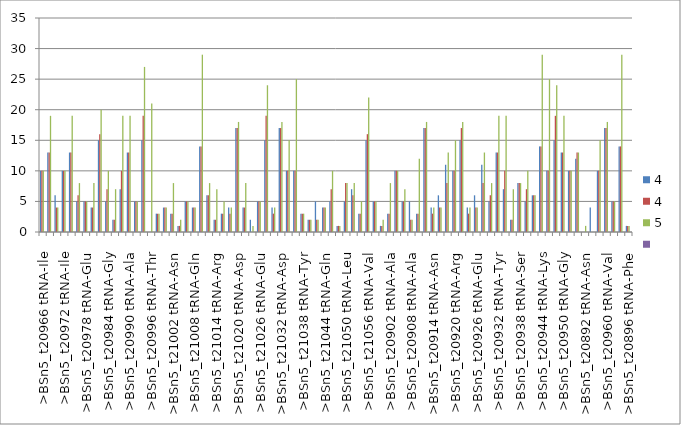
| Category | 4 | 5 | Series 3 |
|---|---|---|---|
| >BSn5_t20966 tRNA-Ile | 10 | 10 |  |
| >BSn5_t20968 tRNA-Ala | 13 | 19 |  |
| >BSn5_t20970 tRNA-Ser | 4 | 4 |  |
| >BSn5_t20972 tRNA-Ile | 10 | 10 |  |
| >BSn5_t20974 tRNA-Ala | 13 | 19 |  |
| >BSn5_t20976 tRNA-Met | 6 | 8 |  |
| >BSn5_t20978 tRNA-Glu | 5 | 5 |  |
| >BSn5_t20980 tRNA-Asn | 4 | 8 |  |
| >BSn5_t20982 tRNA-Thr | 16 | 20 |  |
| >BSn5_t20984 tRNA-Gly | 7 | 10 |  |
| >BSn5_t20986 tRNA-Arg | 2 | 7 |  |
| >BSn5_t20988 tRNA-Pro | 10 | 19 |  |
| >BSn5_t20990 tRNA-Ala | 13 | 19 |  |
| >BSn5_t20992 tRNA-Glu | 5 | 5 |  |
| >BSn5_t20994 tRNA-Val | 19 | 27 |  |
| >BSn5_t20996 tRNA-Thr | 0 | 21 |  |
| >BSn5_t20998 tRNA-Tyr | 3 | 3 |  |
| >BSn5_t21000 tRNA-Gln | 4 | 4 |  |
| >BSn5_t21002 tRNA-Asn | 3 | 8 |  |
| >BSn5_t21004 tRNA-Ser | 1 | 2 |  |
| >BSn5_t21006 tRNA-Glu | 5 | 5 |  |
| >BSn5_t21008 tRNA-Gln | 4 | 4 |  |
| >BSn5_t21010 tRNA-Lys | 14 | 29 |  |
| >BSn5_t21012 tRNA-Leu | 6 | 8 |  |
| >BSn5_t21014 tRNA-Arg | 2 | 7 |  |
| >BSn5_t21016 tRNA-Gly | 3 | 5 |  |
| >BSn5_t21018 tRNA-Met | 3 | 4 |  |
| >BSn5_t21020 tRNA-Asp | 17 | 18 |  |
| >BSn5_t21022 tRNA-Asn | 4 | 8 |  |
| >BSn5_t21024 tRNA-Ser | 0 | 1 |  |
| >BSn5_t21026 tRNA-Glu | 5 | 5 |  |
| >BSn5_t21028 tRNA-Val | 19 | 24 |  |
| >BSn5_t21030 tRNA-Met | 3 | 4 |  |
| >BSn5_t21032 tRNA-Asp | 17 | 18 |  |
| >BSn5_t21034 tRNA-Phe | 10 | 15 |  |
| >BSn5_t21036 tRNA-Thr | 10 | 25 |  |
| >BSn5_t21038 tRNA-Tyr | 3 | 3 |  |
| >BSn5_t21040 tRNA-Trp | 2 | 2 |  |
| >BSn5_t21042 tRNA-His | 2 | 2 |  |
| >BSn5_t21044 tRNA-Gln | 4 | 4 |  |
| >BSn5_t21046 tRNA-Gly | 7 | 10 |  |
| >BSn5_t21048 tRNA-Cys | 1 | 1 |  |
| >BSn5_t21050 tRNA-Leu | 8 | 8 |  |
| >BSn5_t21052 tRNA-Leu | 6 | 8 |  |
| >BSn5_t21054 tRNA-Gly | 3 | 5 |  |
| >BSn5_t21056 tRNA-Val | 16 | 22 |  |
| >BSn5_t20898 tRNA-Gln | 5 | 5 |  |
| >BSn5_t20900 tRNA-Ile | 1 | 2 |  |
| >BSn5_t20902 tRNA-Ala | 3 | 8 |  |
| >BSn5_t20904 tRNA-Ser | 10 | 10 |  |
| >BSn5_t20906 tRNA-Ile | 5 | 7 |  |
| >BSn5_t20908 tRNA-Ala | 2 | 2 |  |
| >BSn5_t20910 tRNA-Met | 3 | 12 |  |
| >BSn5_t20912 tRNA-Glu | 17 | 18 |  |
| >BSn5_t20914 tRNA-Asn | 3 | 4 |  |
| >BSn5_t20916 tRNA-Thr | 4 | 4 |  |
| >BSn5_t20918 tRNA-Gly | 8 | 13 |  |
| >BSn5_t20920 tRNA-Arg | 10 | 15 |  |
| >BSn5_t20922 tRNA-Pro | 17 | 18 |  |
| >BSn5_t20924 tRNA-Ala | 3 | 4 |  |
| >BSn5_t20926 tRNA-Glu | 4 | 4 |  |
| >BSn5_t20928 tRNA-Val | 8 | 13 |  |
| >BSn5_t20930 tRNA-Thr | 6 | 8 |  |
| >BSn5_t20932 tRNA-Tyr | 13 | 19 |  |
| >BSn5_t20934 tRNA-Gln | 10 | 19 |  |
| >BSn5_t20936 tRNA-Asn | 2 | 7 |  |
| >BSn5_t20938 tRNA-Ser | 8 | 8 |  |
| >BSn5_t20940 tRNA-Glu | 7 | 10 |  |
| >BSn5_t20942 tRNA-Gln | 6 | 6 |  |
| >BSn5_t20944 tRNA-Lys | 14 | 29 |  |
| >BSn5_t20946 tRNA-Leu | 10 | 25 |  |
| >BSn5_t20948 tRNA-Arg | 19 | 24 |  |
| >BSn5_t20950 tRNA-Gly | 13 | 19 |  |
| >BSn5_t20952 tRNA-Met | 10 | 10 |  |
| >BSn5_t20954 tRNA-Asp | 13 | 13 |  |
| >BSn5_t20892 tRNA-Asn | 0 | 1 |  |
| >BSn5_t20956 tRNA-Ser | 0 | 0 |  |
| >BSn5_t20958 tRNA-Glu | 10 | 15 |  |
| >BSn5_t20960 tRNA-Val | 17 | 18 |  |
| >BSn5_t20962 tRNA-Met | 5 | 5 |  |
| >BSn5_t20964 tRNA-Asp | 14 | 29 |  |
| >BSn5_t20896 tRNA-Phe | 1 | 1 |  |